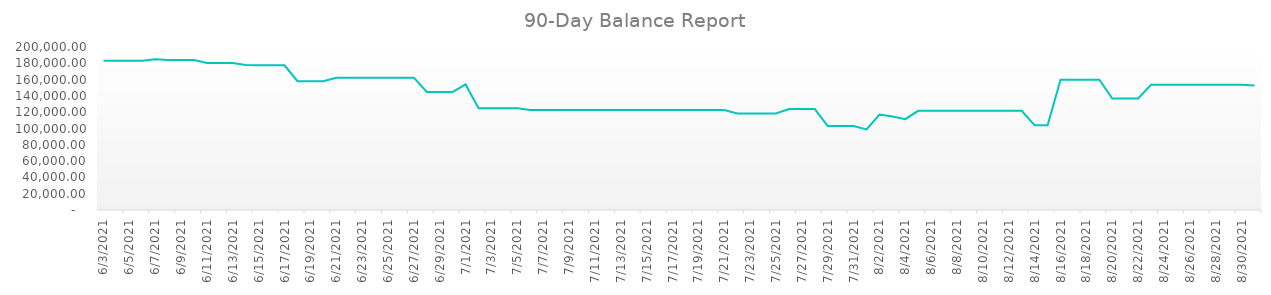
| Category | Value |
|---|---|
| 6/3/21 | 183244.898 |
| 6/4/21 | 183244.898 |
| 6/5/21 | 183244.898 |
| 6/6/21 | 183244.898 |
| 6/7/21 | 185040.398 |
| 6/8/21 | 184045.539 |
| 6/9/21 | 184045.539 |
| 6/10/21 | 184045.539 |
| 6/11/21 | 180250.779 |
| 6/12/21 | 180250.779 |
| 6/13/21 | 180250.779 |
| 6/14/21 | 177831.603 |
| 6/15/21 | 177531.603 |
| 6/16/21 | 177531.603 |
| 6/17/21 | 177531.603 |
| 6/18/21 | 158014.569 |
| 6/19/21 | 158014.569 |
| 6/20/21 | 158014.569 |
| 6/21/21 | 162344.569 |
| 6/22/21 | 162344.569 |
| 6/23/21 | 162344.569 |
| 6/24/21 | 162344.569 |
| 6/25/21 | 162344.569 |
| 6/26/21 | 162344.569 |
| 6/27/21 | 162344.569 |
| 6/28/21 | 144835.045 |
| 6/29/21 | 144835.045 |
| 6/30/21 | 144835.045 |
| 7/1/21 | 153983.845 |
| 7/2/21 | 124785.949 |
| 7/3/21 | 124785.949 |
| 7/4/21 | 124785.949 |
| 7/5/21 | 124785.949 |
| 7/6/21 | 122706.975 |
| 7/7/21 | 122706.975 |
| 7/8/21 | 122706.975 |
| 7/9/21 | 122706.975 |
| 7/10/21 | 122706.975 |
| 7/11/21 | 122706.975 |
| 7/12/21 | 122706.975 |
| 7/13/21 | 122706.975 |
| 7/14/21 | 122706.975 |
| 7/15/21 | 122706.975 |
| 7/16/21 | 122706.975 |
| 7/17/21 | 122706.975 |
| 7/18/21 | 122706.975 |
| 7/19/21 | 122706.975 |
| 7/20/21 | 122706.975 |
| 7/21/21 | 122706.975 |
| 7/22/21 | 118486.26 |
| 7/23/21 | 118486.26 |
| 7/24/21 | 118486.26 |
| 7/25/21 | 118486.26 |
| 7/26/21 | 123836.26 |
| 7/27/21 | 123836.26 |
| 7/28/21 | 123836.26 |
| 7/29/21 | 103046.528 |
| 7/30/21 | 103046.528 |
| 7/31/21 | 103046.528 |
| 8/1/21 | 98888.582 |
| 8/2/21 | 117021.479 |
| 8/3/21 | 114771.996 |
| 8/4/21 | 111527.654 |
| 8/5/21 | 121719.154 |
| 8/6/21 | 121719.154 |
| 8/7/21 | 121719.154 |
| 8/8/21 | 121719.154 |
| 8/9/21 | 121719.154 |
| 8/10/21 | 121719.154 |
| 8/11/21 | 121719.154 |
| 8/12/21 | 121719.154 |
| 8/13/21 | 121719.154 |
| 8/14/21 | 103909.63 |
| 8/15/21 | 103909.63 |
| 8/16/21 | 159918.794 |
| 8/17/21 | 159918.794 |
| 8/18/21 | 159918.794 |
| 8/19/21 | 159918.794 |
| 8/20/21 | 136769.204 |
| 8/21/21 | 136769.204 |
| 8/22/21 | 136769.204 |
| 8/23/21 | 153550.702 |
| 8/24/21 | 153550.702 |
| 8/25/21 | 153550.702 |
| 8/26/21 | 153550.702 |
| 8/27/21 | 153550.702 |
| 8/28/21 | 153550.702 |
| 8/29/21 | 153550.702 |
| 8/30/21 | 153550.702 |
| 8/31/21 | 152855.038 |